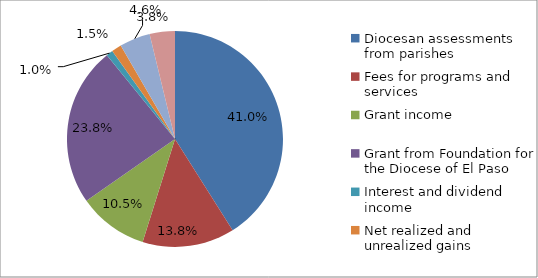
| Category | 2014 | Series 1 |
|---|---|---|
| Diocesan assessments from parishes | 2318208 |  |
| Fees for programs and services | 779315 |  |
| Grant income | 590408 |  |
| Grant from Foundation for the Diocese of El Paso | 1346233 |  |
| Interest and dividend income | 56326 |  |
| Net realized and unrealized gains | 84088 |  |
| Other income | 259334 |  |
| Contribution income | 213715 |  |